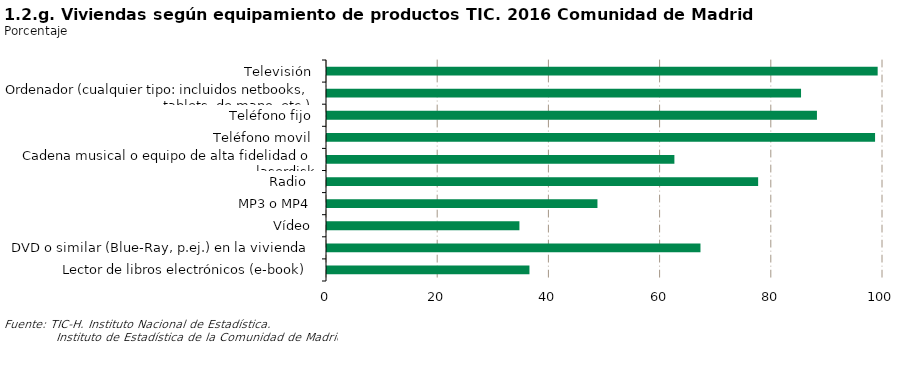
| Category | Series 0 |
|---|---|
| Televisión | 99.04 |
| Ordenador (cualquier tipo: incluidos netbooks, tablets, de mano, etc.) | 85.259 |
| Teléfono fijo | 88.118 |
| Teléfono movil | 98.573 |
| Cadena musical o equipo de alta fidelidad o laserdisk | 62.481 |
| Radio  | 77.544 |
|  MP3 o MP4 | 48.642 |
| Vídeo | 34.607 |
| DVD o similar (Blue-Ray, p.ej.) en la vivienda | 67.171 |
| Lector de libros electrónicos (e-book) | 36.412 |